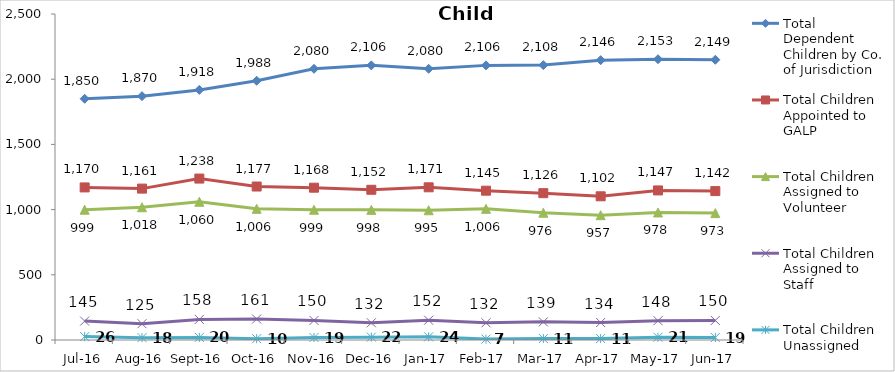
| Category | Total Dependent Children by Co. of Jurisdiction | Total Children Appointed to GALP | Total Children Assigned to Volunteer | Total Children Assigned to Staff | Total Children Unassigned |
|---|---|---|---|---|---|
| Jul-16 | 1850 | 1170 | 999 | 145 | 26 |
| Aug-16 | 1870 | 1161 | 1018 | 125 | 18 |
| Sep-16 | 1918 | 1238 | 1060 | 158 | 20 |
| Oct-16 | 1988 | 1177 | 1006 | 161 | 10 |
| Nov-16 | 2080 | 1168 | 999 | 150 | 19 |
| Dec-16 | 2106 | 1152 | 998 | 132 | 22 |
| Jan-17 | 2080 | 1171 | 995 | 152 | 24 |
| Feb-17 | 2106 | 1145 | 1006 | 132 | 7 |
| Mar-17 | 2108 | 1126 | 976 | 139 | 11 |
| Apr-17 | 2146 | 1102 | 957 | 134 | 11 |
| May-17 | 2153 | 1147 | 978 | 148 | 21 |
| Jun-17 | 2149 | 1142 | 973 | 150 | 19 |